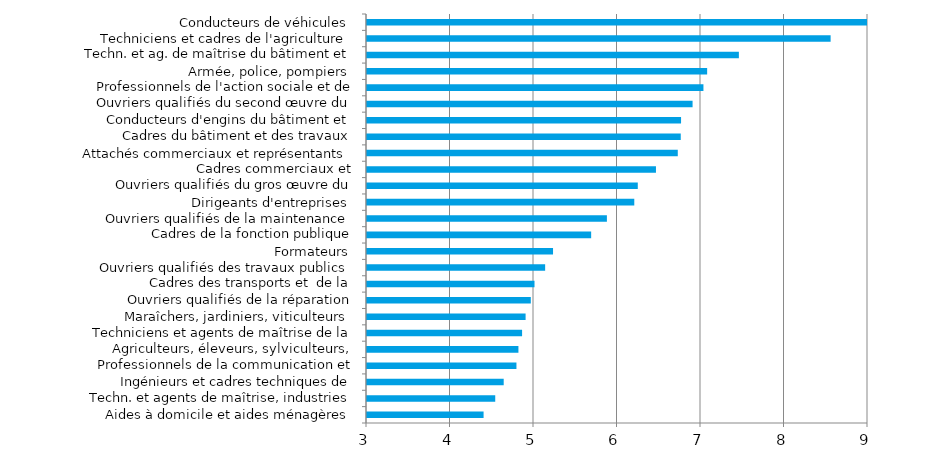
| Category | Series 0 |
|---|---|
| Aides à domicile et aides ménagères | 4.396 |
| Techn. et agents de maîtrise, industries mécaniques | 4.536 |
| Ingénieurs et cadres techniques de l'industrie | 4.637 |
| Professionnels de la communication et de l'information | 4.79 |
| Agriculteurs, éleveurs, sylviculteurs, bûcherons | 4.813 |
| Techniciens et agents de maîtrise de la maintenance | 4.857 |
| Maraîchers, jardiniers, viticulteurs | 4.899 |
| Ouvriers qualifiés de la réparation automobile | 4.962 |
| Cadres des transports et  de la logistique | 5.006 |
| Ouvriers qualifiés des travaux publics | 5.134 |
| Formateurs | 5.228 |
| Cadres de la fonction publique (catégorie A et assimilés) | 5.685 |
| Ouvriers qualifiés de la maintenance | 5.873 |
| Dirigeants d'entreprises | 6.201 |
| Ouvriers qualifiés du gros œuvre du bâtiment | 6.243 |
| Cadres commerciaux et technico-commerciaux | 6.461 |
| Attachés commerciaux et représentants | 6.722 |
| Cadres du bâtiment et des travaux publics | 6.758 |
| Conducteurs d'engins du bâtiment et des travaux publics | 6.761 |
| Ouvriers qualifiés du second œuvre du bâtiment | 6.899 |
| Professionnels de l'action sociale et de l'orientation | 7.029 |
| Armée, police, pompiers | 7.074 |
| Techn. et ag. de maîtrise du bâtiment et travaux publics | 7.454 |
| Techniciens et cadres de l'agriculture | 8.552 |
| Conducteurs de véhicules | 9.026 |